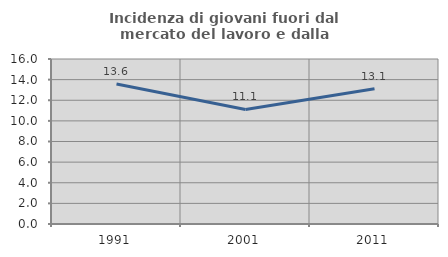
| Category | Incidenza di giovani fuori dal mercato del lavoro e dalla formazione  |
|---|---|
| 1991.0 | 13.58 |
| 2001.0 | 11.111 |
| 2011.0 | 13.115 |